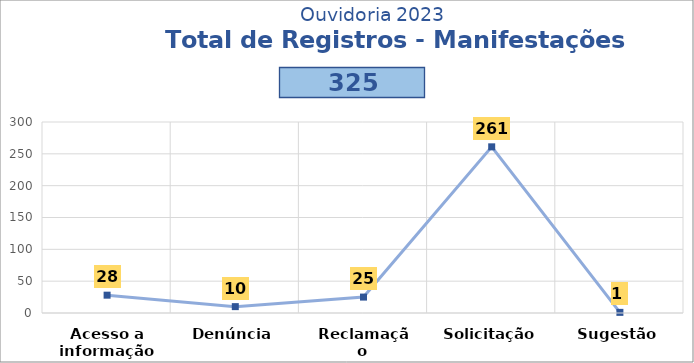
| Category | Series 2 |
|---|---|
| Acesso a informação | 28 |
| Denúncia | 10 |
| Reclamação | 25 |
| Solicitação | 261 |
| Sugestão | 1 |